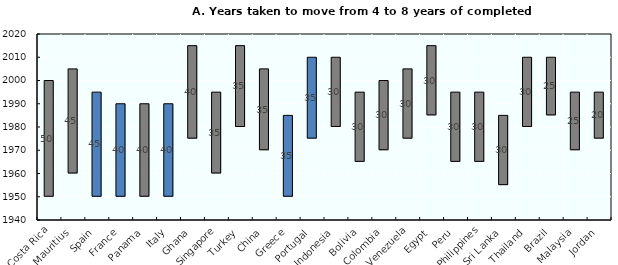
| Category | Series 0 | Series 1 |
|---|---|---|
| Costa Rica | 1950 | 50 |
| Mauritius | 1960 | 45 |
| Spain | 1950 | 45 |
| France | 1950 | 40 |
| Panama | 1950 | 40 |
| Italy | 1950 | 40 |
| Ghana | 1975 | 40 |
| Singapore | 1960 | 35 |
| Turkey | 1980 | 35 |
| China | 1970 | 35 |
| Greece | 1950 | 35 |
| Portugal | 1975 | 35 |
| Indonesia | 1980 | 30 |
| Bolivia | 1965 | 30 |
| Colombia | 1970 | 30 |
| Venezuela | 1975 | 30 |
| Egypt | 1985 | 30 |
| Peru | 1965 | 30 |
| Philippines | 1965 | 30 |
| Sri Lanka | 1955 | 30 |
| Thailand | 1980 | 30 |
| Brazil | 1985 | 25 |
| Malaysia | 1970 | 25 |
| Jordan | 1975 | 20 |